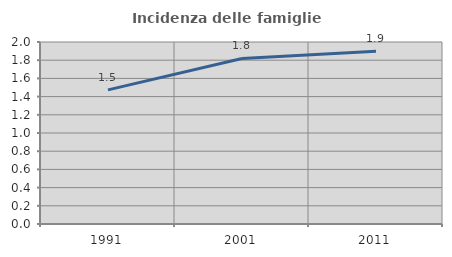
| Category | Incidenza delle famiglie numerose |
|---|---|
| 1991.0 | 1.474 |
| 2001.0 | 1.82 |
| 2011.0 | 1.898 |